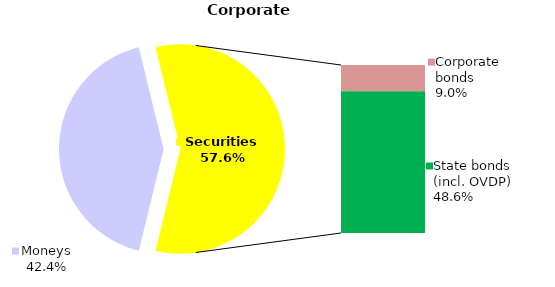
| Category | Corporate |
|---|---|
| Moneys | 91.675 |
| Bank metals | 0 |
| Real estate | 0 |
| Other assets | 0 |
| Equities | 0.038 |
| Corporate bonds | 19.457 |
| Municipal bonds | 0 |
| State bonds (incl. OVDP) | 105.247 |